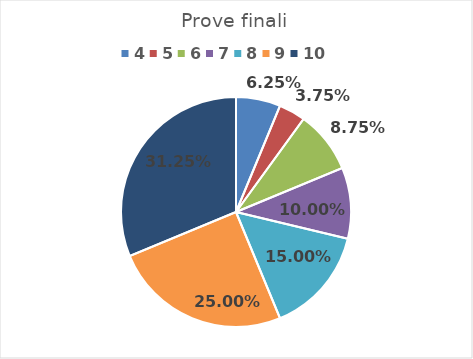
| Category | Series 0 |
|---|---|
| 4.0 | 0.062 |
| 5.0 | 0.038 |
| 6.0 | 0.088 |
| 7.0 | 0.1 |
| 8.0 | 0.15 |
| 9.0 | 0.25 |
| 10.0 | 0.312 |